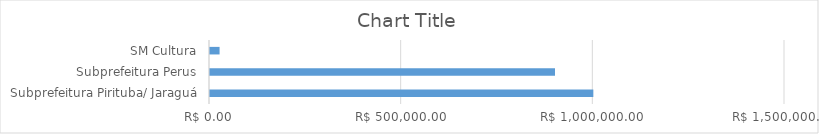
| Category | Series 0 |
|---|---|
| Subprefeitura Pirituba/ Jaraguá | 1000000 |
| Subprefeitura Perus | 900000 |
| SM Cultura | 25000 |